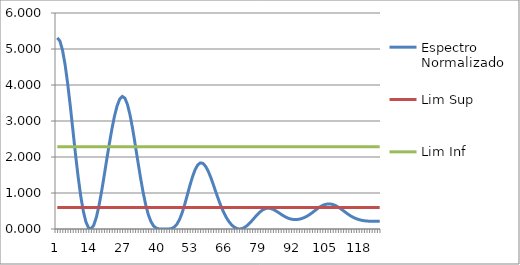
| Category | Espectro Normalizado | Lim Sup | Lim Inf |
|---|---|---|---|
| 0 | 5.31 | 0.596 | 2.281 |
| 1 | 5.223 | 0.596 | 2.281 |
| 2 | 4.969 | 0.596 | 2.281 |
| 3 | 4.564 | 0.596 | 2.281 |
| 4 | 4.034 | 0.596 | 2.281 |
| 5 | 3.413 | 0.596 | 2.281 |
| 6 | 2.746 | 0.596 | 2.281 |
| 7 | 2.078 | 0.596 | 2.281 |
| 8 | 1.457 | 0.596 | 2.281 |
| 9 | 0.921 | 0.596 | 2.281 |
| 10 | 0.497 | 0.596 | 2.281 |
| 11 | 0.199 | 0.596 | 2.281 |
| 12 | 0.035 | 0.596 | 2.281 |
| 13 | 0.005 | 0.596 | 2.281 |
| 14 | 0.103 | 0.596 | 2.281 |
| 15 | 0.319 | 0.596 | 2.281 |
| 16 | 0.635 | 0.596 | 2.281 |
| 17 | 1.028 | 0.596 | 2.281 |
| 18 | 1.468 | 0.596 | 2.281 |
| 19 | 1.921 | 0.596 | 2.281 |
| 20 | 2.364 | 0.596 | 2.281 |
| 21 | 2.776 | 0.596 | 2.281 |
| 22 | 3.136 | 0.596 | 2.281 |
| 23 | 3.42 | 0.596 | 2.281 |
| 24 | 3.607 | 0.596 | 2.281 |
| 25 | 3.684 | 0.596 | 2.281 |
| 26 | 3.635 | 0.596 | 2.281 |
| 27 | 3.455 | 0.596 | 2.281 |
| 28 | 3.159 | 0.596 | 2.281 |
| 29 | 2.773 | 0.596 | 2.281 |
| 30 | 2.331 | 0.596 | 2.281 |
| 31 | 1.873 | 0.596 | 2.281 |
| 32 | 1.427 | 0.596 | 2.281 |
| 33 | 1.02 | 0.596 | 2.281 |
| 34 | 0.673 | 0.596 | 2.281 |
| 35 | 0.401 | 0.596 | 2.281 |
| 36 | 0.208 | 0.596 | 2.281 |
| 37 | 0.087 | 0.596 | 2.281 |
| 38 | 0.026 | 0.596 | 2.281 |
| 39 | 0.004 | 0.596 | 2.281 |
| 40 | 0 | 0.596 | 2.281 |
| 41 | 0.001 | 0.596 | 2.281 |
| 42 | 0 | 0.596 | 2.281 |
| 43 | 0.002 | 0.596 | 2.281 |
| 44 | 0.015 | 0.596 | 2.281 |
| 45 | 0.054 | 0.596 | 2.281 |
| 46 | 0.133 | 0.596 | 2.281 |
| 47 | 0.262 | 0.596 | 2.281 |
| 48 | 0.446 | 0.596 | 2.281 |
| 49 | 0.68 | 0.596 | 2.281 |
| 50 | 0.942 | 0.596 | 2.281 |
| 51 | 1.207 | 0.596 | 2.281 |
| 52 | 1.451 | 0.596 | 2.281 |
| 53 | 1.647 | 0.596 | 2.281 |
| 54 | 1.778 | 0.596 | 2.281 |
| 55 | 1.836 | 0.596 | 2.281 |
| 56 | 1.823 | 0.596 | 2.281 |
| 57 | 1.745 | 0.596 | 2.281 |
| 58 | 1.613 | 0.596 | 2.281 |
| 59 | 1.438 | 0.596 | 2.281 |
| 60 | 1.235 | 0.596 | 2.281 |
| 61 | 1.023 | 0.596 | 2.281 |
| 62 | 0.817 | 0.596 | 2.281 |
| 63 | 0.628 | 0.596 | 2.281 |
| 64 | 0.462 | 0.596 | 2.281 |
| 65 | 0.321 | 0.596 | 2.281 |
| 66 | 0.206 | 0.596 | 2.281 |
| 67 | 0.118 | 0.596 | 2.281 |
| 68 | 0.054 | 0.596 | 2.281 |
| 69 | 0.015 | 0.596 | 2.281 |
| 70 | 0 | 0.596 | 2.281 |
| 71 | 0.01 | 0.596 | 2.281 |
| 72 | 0.042 | 0.596 | 2.281 |
| 73 | 0.095 | 0.596 | 2.281 |
| 74 | 0.163 | 0.596 | 2.281 |
| 75 | 0.242 | 0.596 | 2.281 |
| 76 | 0.325 | 0.596 | 2.281 |
| 77 | 0.406 | 0.596 | 2.281 |
| 78 | 0.476 | 0.596 | 2.281 |
| 79 | 0.531 | 0.596 | 2.281 |
| 80 | 0.566 | 0.596 | 2.281 |
| 81 | 0.579 | 0.596 | 2.281 |
| 82 | 0.571 | 0.596 | 2.281 |
| 83 | 0.545 | 0.596 | 2.281 |
| 84 | 0.506 | 0.596 | 2.281 |
| 85 | 0.461 | 0.596 | 2.281 |
| 86 | 0.413 | 0.596 | 2.281 |
| 87 | 0.366 | 0.596 | 2.281 |
| 88 | 0.325 | 0.596 | 2.281 |
| 89 | 0.294 | 0.596 | 2.281 |
| 90 | 0.274 | 0.596 | 2.281 |
| 91 | 0.263 | 0.596 | 2.281 |
| 92 | 0.263 | 0.596 | 2.281 |
| 93 | 0.271 | 0.596 | 2.281 |
| 94 | 0.29 | 0.596 | 2.281 |
| 95 | 0.318 | 0.596 | 2.281 |
| 96 | 0.355 | 0.596 | 2.281 |
| 97 | 0.399 | 0.596 | 2.281 |
| 98 | 0.45 | 0.596 | 2.281 |
| 99 | 0.506 | 0.596 | 2.281 |
| 100 | 0.562 | 0.596 | 2.281 |
| 101 | 0.613 | 0.596 | 2.281 |
| 102 | 0.654 | 0.596 | 2.281 |
| 103 | 0.681 | 0.596 | 2.281 |
| 104 | 0.696 | 0.596 | 2.281 |
| 105 | 0.695 | 0.596 | 2.281 |
| 106 | 0.68 | 0.596 | 2.281 |
| 107 | 0.651 | 0.596 | 2.281 |
| 108 | 0.611 | 0.596 | 2.281 |
| 109 | 0.563 | 0.596 | 2.281 |
| 110 | 0.509 | 0.596 | 2.281 |
| 111 | 0.455 | 0.596 | 2.281 |
| 112 | 0.402 | 0.596 | 2.281 |
| 113 | 0.356 | 0.596 | 2.281 |
| 114 | 0.317 | 0.596 | 2.281 |
| 115 | 0.285 | 0.596 | 2.281 |
| 116 | 0.261 | 0.596 | 2.281 |
| 117 | 0.242 | 0.596 | 2.281 |
| 118 | 0.23 | 0.596 | 2.281 |
| 119 | 0.222 | 0.596 | 2.281 |
| 120 | 0.217 | 0.596 | 2.281 |
| 121 | 0.215 | 0.596 | 2.281 |
| 122 | 0.215 | 0.596 | 2.281 |
| 123 | 0.216 | 0.596 | 2.281 |
| 124 | 0.216 | 0.596 | 2.281 |